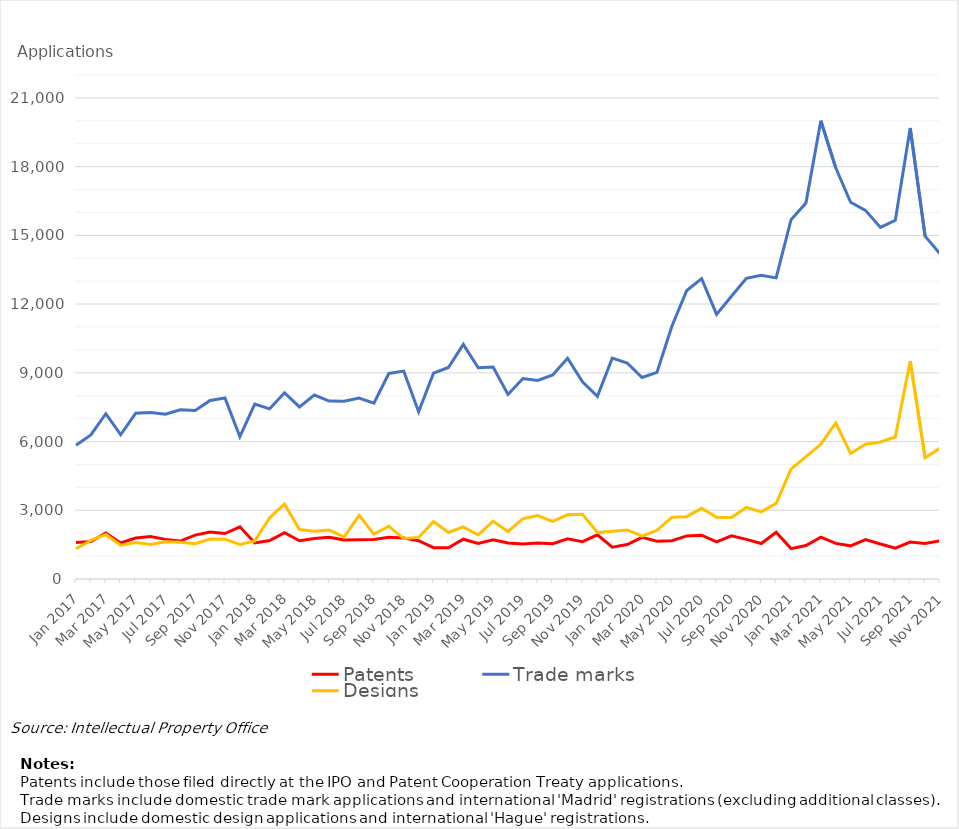
| Category | Patents | Trade marks | Designs |
|---|---|---|---|
| Jan 2017 | 1596 | 5843 | 1318 |
| Feb 2017 | 1640 | 6288 | 1687 |
| Mar 2017 | 2011 | 7214 | 1940 |
| Apr 2017 | 1573 | 6297 | 1474 |
| May 2017 | 1790 | 7234 | 1592 |
| Jun 2017 | 1853 | 7263 | 1502 |
| Jul 2017 | 1730 | 7197 | 1627 |
| Aug 2017 | 1657 | 7389 | 1600 |
| Sep 2017 | 1915 | 7359 | 1544 |
| Oct 2017 | 2055 | 7792 | 1745 |
| Nov 2017 | 1983 | 7901 | 1736 |
| Dec 2017 | 2277 | 6211 | 1507 |
| Jan 2018 | 1575 | 7634 | 1658 |
| Feb 2018 | 1676 | 7428 | 2672 |
| Mar 2018 | 2022 | 8127 | 3267 |
| Apr 2018 | 1670 | 7512 | 2160 |
| May 2018 | 1767 | 8030 | 2083 |
| Jun 2018 | 1821 | 7769 | 2136 |
| Jul 2018 | 1704 | 7757 | 1832 |
| Aug 2018 | 1713 | 7897 | 2777 |
| Sep 2018 | 1725 | 7673 | 1960 |
| Oct 2018 | 1818 | 8972 | 2302 |
| Nov 2018 | 1787 | 9076 | 1765 |
| Dec 2018 | 1670 | 7304 | 1815 |
| Jan 2019 | 1367 | 8984 | 2505 |
| Feb 2019 | 1361 | 9234 | 2031 |
| Mar 2019 | 1737 | 10243 | 2274 |
| Apr 2019 | 1552 | 9219 | 1923 |
| May 2019 | 1710 | 9251 | 2520 |
| Jun 2019 | 1569 | 8053 | 2074 |
| Jul 2019 | 1527 | 8752 | 2634 |
| Aug 2019 | 1571 | 8670 | 2768 |
| Sep 2019 | 1540 | 8907 | 2511 |
| Oct 2019 | 1755 | 9636 | 2800 |
| Nov 2019 | 1630 | 8607 | 2827 |
| Dec 2019 | 1926 | 7970 | 2028 |
| Jan 2020 | 1392 | 9642 | 2082 |
| Feb 2020 | 1506 | 9428 | 2143 |
| Mar 2020 | 1819 | 8794 | 1871 |
| Apr 2020 | 1648 | 9021 | 2127 |
| May 2020 | 1671 | 11035 | 2694 |
| Jun 2020 | 1880 | 12593 | 2721 |
| Jul 2020 | 1911 | 13110 | 3085 |
| Aug 2020 | 1616 | 11551 | 2694 |
| Sep 2020 | 1886 | 12340 | 2686 |
| Oct 2020 | 1731 | 13126 | 3124 |
| Nov 2020 | 1548 | 13254 | 2930 |
| Dec 2020 | 2043 | 13143 | 3303 |
| Jan 2021 | 1326 | 15685 | 4792 |
| Feb 2021 | 1463 | 16412 | 5341 |
| Mar 2021 | 1826 | 20001 | 5879 |
| Apr 2021 | 1554 | 17951 | 6814 |
| May 2021 | 1447 | 16446 | 5480 |
| Jun 2021 | 1717 | 16091 | 5882 |
| Jul 2021 | 1528 | 15345 | 5982 |
| Aug 2021 | 1348 | 15657 | 6199 |
| Sep 2021 | 1610 | 19686 | 9518 |
| Oct 2021 | 1553 | 14966 | 5289 |
| Nov 2021 | 1665 | 14194 | 5709 |